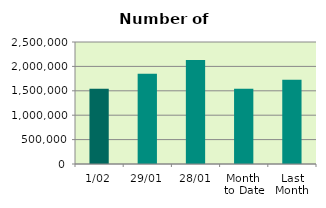
| Category | Series 0 |
|---|---|
| 1/02 | 1542990 |
| 29/01 | 1848916 |
| 28/01 | 2130682 |
| Month 
to Date | 1542990 |
| Last
Month | 1728874.4 |